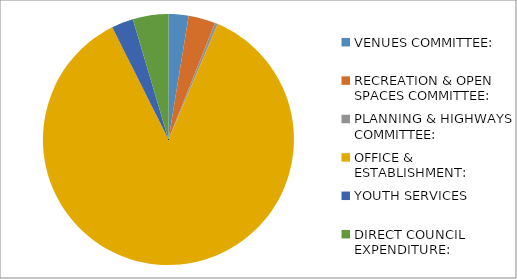
| Category | Series 0 |
|---|---|
| VENUES COMMITTEE: | 9795 |
| RECREATION & OPEN SPACES COMMITTEE: | 13195 |
| PLANNING & HIGHWAYS COMMITTEE: | 1500 |
| OFFICE & ESTABLISHMENT: | 327960 |
| YOUTH SERVICES | 10700 |
| DIRECT COUNCIL EXPENDITURE: | 17460 |